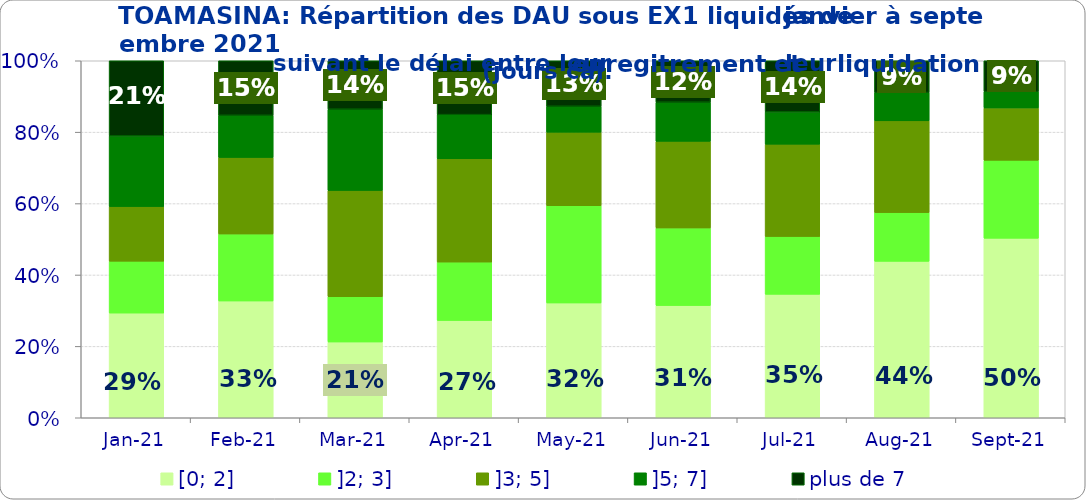
| Category | [0; 2] | ]2; 3] | ]3; 5] | ]5; 7] | plus de 7 |
|---|---|---|---|---|---|
| 2021-01-01 | 0.293 | 0.145 | 0.153 | 0.198 | 0.211 |
| 2021-02-01 | 0.327 | 0.188 | 0.214 | 0.118 | 0.153 |
| 2021-03-01 | 0.212 | 0.127 | 0.298 | 0.228 | 0.136 |
| 2021-04-01 | 0.273 | 0.164 | 0.289 | 0.124 | 0.151 |
| 2021-05-01 | 0.322 | 0.273 | 0.206 | 0.073 | 0.127 |
| 2021-06-01 | 0.314 | 0.217 | 0.243 | 0.11 | 0.116 |
| 2021-07-01 | 0.346 | 0.162 | 0.259 | 0.09 | 0.143 |
| 2021-08-01 | 0.438 | 0.137 | 0.257 | 0.079 | 0.089 |
| 2021-09-01 | 0.503 | 0.218 | 0.147 | 0.046 | 0.086 |